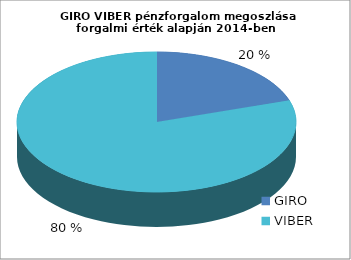
| Category | Series 0 |
|---|---|
| GIRO | 0.2 |
| VIBER | 0.8 |